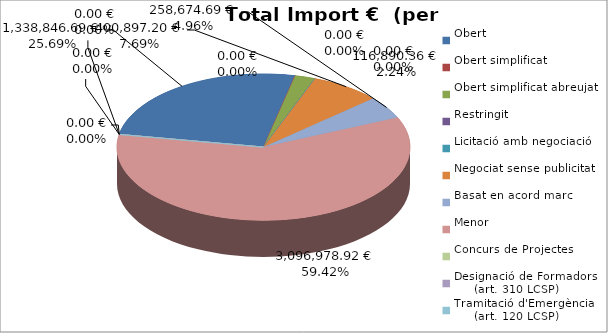
| Category | Total preu
(amb IVA) |
|---|---|
| Obert | 1338846.692 |
| Obert simplificat | 0 |
| Obert simplificat abreujat | 116890.356 |
| Restringit | 0 |
| Licitació amb negociació | 0 |
| Negociat sense publicitat | 400897.2 |
| Basat en acord marc | 258674.69 |
| Menor | 3096978.92 |
| Concurs de Projectes | 0 |
| Designació de Formadors
     (art. 310 LCSP) | 0 |
| Tramitació d'Emergència
     (art. 120 LCSP) | 0 |